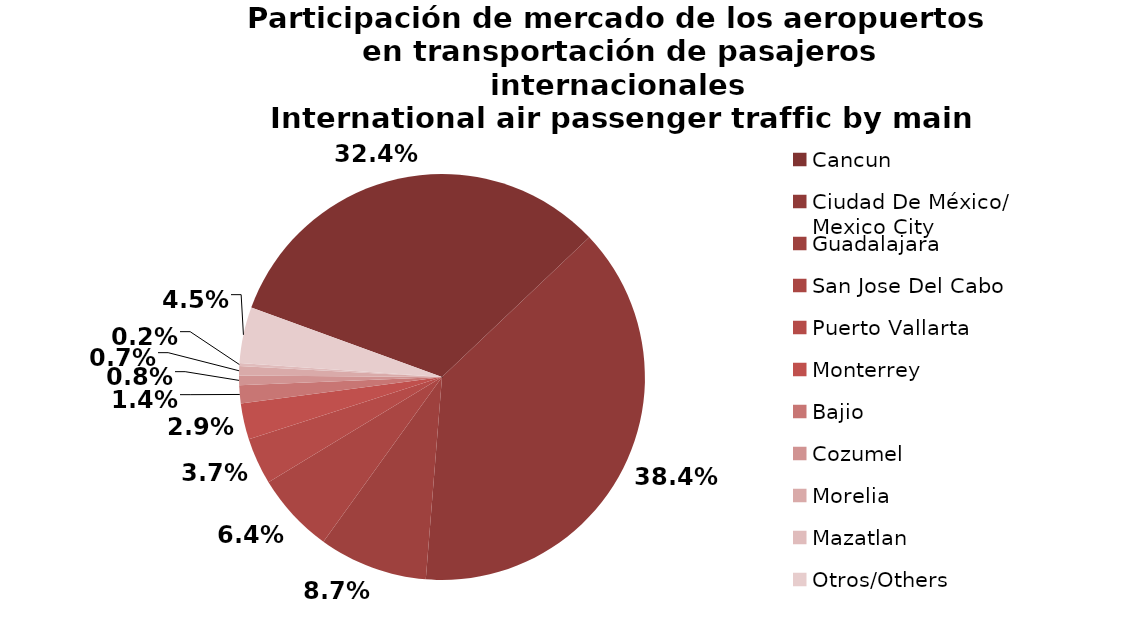
| Category | Series 0 |
|---|---|
| Cancun | 1327.412 |
| Ciudad De México/
Mexico City | 1573.323 |
| Guadalajara | 355.131 |
| San Jose Del Cabo | 261.933 |
| Puerto Vallarta | 152.342 |
| Monterrey | 118.25 |
| Bajio | 58.785 |
| Cozumel | 31.869 |
| Morelia | 30.033 |
| Mazatlan | 10.209 |
| Otros/Others | 182.608 |